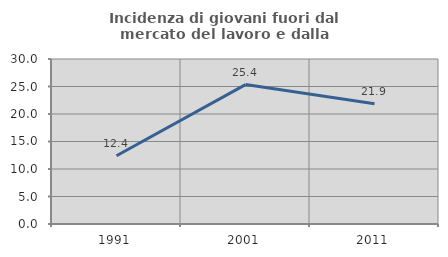
| Category | Incidenza di giovani fuori dal mercato del lavoro e dalla formazione  |
|---|---|
| 1991.0 | 12.407 |
| 2001.0 | 25.352 |
| 2011.0 | 21.875 |